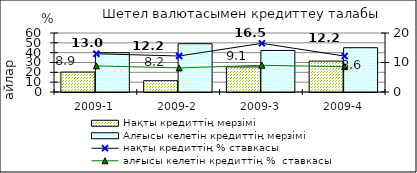
| Category | Нақты кредиттің мерзімі  | Алғысы келетін кредиттің мерзімі  |
|---|---|---|
| 2009-1 | 20.25 | 39.89 |
| 2009-2 | 11.5 | 49.1 |
| 2009-3 | 25.5 | 42.28 |
| 2009-4 | 31.4 | 45.06 |